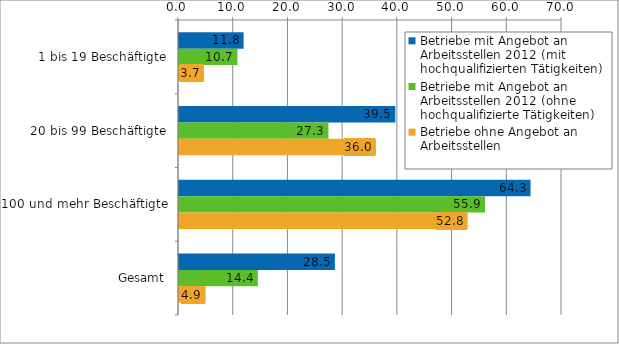
| Category | Betriebe mit Angebot an Arbeitsstellen 2012 (mit hochqualifizierten Tätigkeiten) | Betriebe mit Angebot an Arbeitsstellen 2012 (ohne hochqualifizierte Tätigkeiten) | Betriebe ohne Angebot an Arbeitsstellen |
|---|---|---|---|
|  1 bis 19 Beschäftigte | 11.812 | 10.676 | 3.682 |
| 20 bis 99 Beschäftigte | 39.533 | 27.307 | 35.998 |
| 100 und mehr Beschäftigte | 64.256 | 55.928 | 52.765 |
| Gesamt | 28.492 | 14.409 | 4.861 |